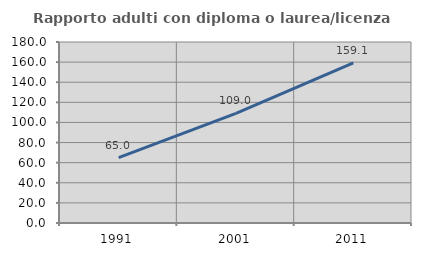
| Category | Rapporto adulti con diploma o laurea/licenza media  |
|---|---|
| 1991.0 | 64.984 |
| 2001.0 | 108.952 |
| 2011.0 | 159.149 |